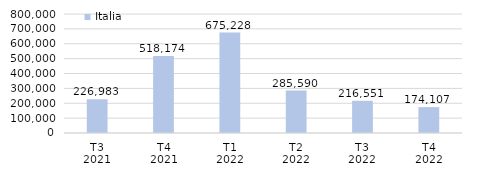
| Category | Italia |
|---|---|
| T3
2021 | 226983 |
| T4
2021 | 518173.522 |
| T1
2022 | 675227.656 |
| T2
2022 | 285590.495 |
| T3
2022 | 216551.348 |
| T4
2022 | 174106.674 |